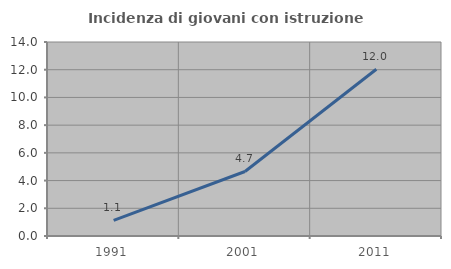
| Category | Incidenza di giovani con istruzione universitaria |
|---|---|
| 1991.0 | 1.128 |
| 2001.0 | 4.655 |
| 2011.0 | 12.035 |